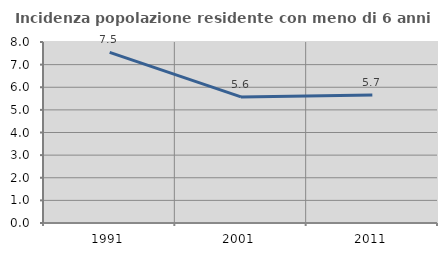
| Category | Incidenza popolazione residente con meno di 6 anni |
|---|---|
| 1991.0 | 7.54 |
| 2001.0 | 5.574 |
| 2011.0 | 5.662 |